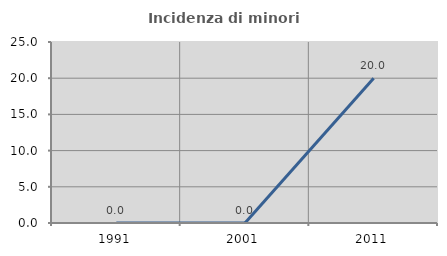
| Category | Incidenza di minori stranieri |
|---|---|
| 1991.0 | 0 |
| 2001.0 | 0 |
| 2011.0 | 20 |